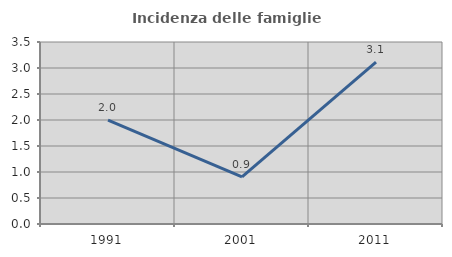
| Category | Incidenza delle famiglie numerose |
|---|---|
| 1991.0 | 1.999 |
| 2001.0 | 0.907 |
| 2011.0 | 3.114 |